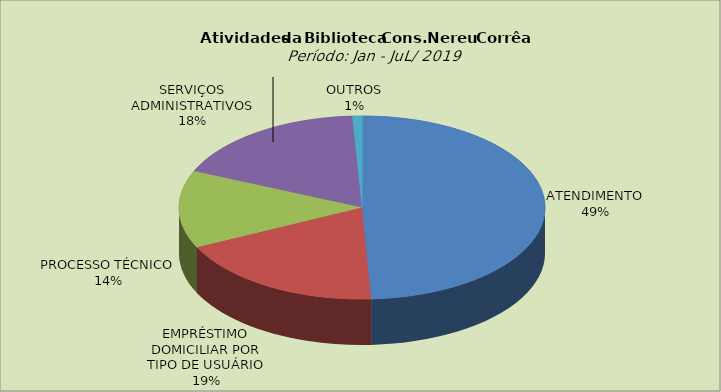
| Category | Series 0 |
|---|---|
| ATENDIMENTO | 49.201 |
| EMPRÉSTIMO DOMICILIAR POR TIPO DE USUÁRIO | 18.653 |
| PROCESSO TÉCNICO | 13.694 |
| SERVIÇOS ADMINISTRATIVOS | 17.597 |
| OUTROS | 0.855 |